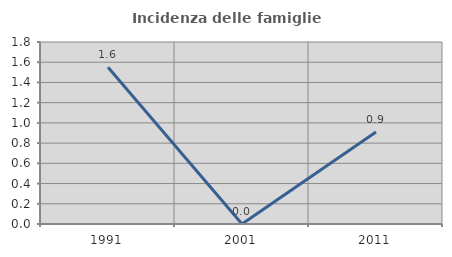
| Category | Incidenza delle famiglie numerose |
|---|---|
| 1991.0 | 1.55 |
| 2001.0 | 0 |
| 2011.0 | 0.909 |